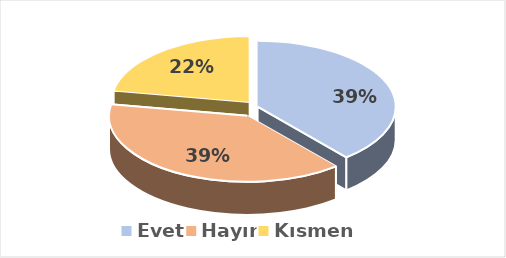
| Category | Evet |
|---|---|
| Evet | 0.389 |
| Hayır | 0.389 |
| Kısmen | 0.222 |